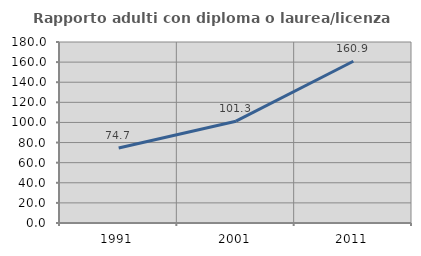
| Category | Rapporto adulti con diploma o laurea/licenza media  |
|---|---|
| 1991.0 | 74.661 |
| 2001.0 | 101.264 |
| 2011.0 | 160.882 |